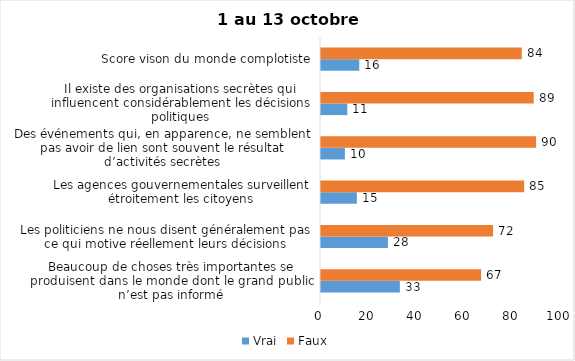
| Category | Vrai | Faux |
|---|---|---|
| Beaucoup de choses très importantes se produisent dans le monde dont le grand public n’est pas informé | 33 | 67 |
| Les politiciens ne nous disent généralement pas ce qui motive réellement leurs décisions | 28 | 72 |
| Les agences gouvernementales surveillent étroitement les citoyens | 15 | 85 |
| Des événements qui, en apparence, ne semblent pas avoir de lien sont souvent le résultat d’activités secrètes | 10 | 90 |
| Il existe des organisations secrètes qui influencent considérablement les décisions politiques | 11 | 89 |
| Score vison du monde complotiste | 16 | 84 |